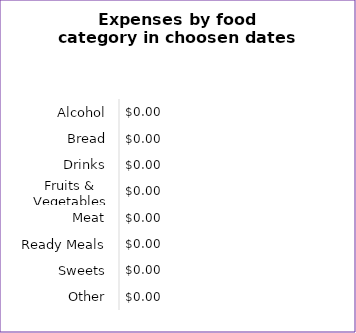
| Category | Expenses |
|---|---|
| Alcohol | 0 |
| Bread | 0 |
| Drinks | 0 |
| Fruits & Vegetables | 0 |
| Meat | 0 |
| Ready Meals | 0 |
| Sweets | 0 |
| Other | 0 |